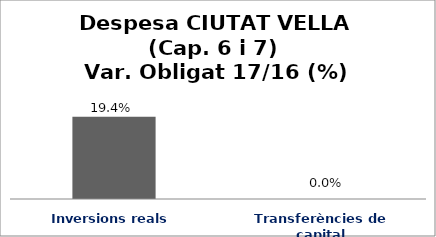
| Category | Series 0 |
|---|---|
| Inversions reals | 0.194 |
| Transferències de capital | 0 |